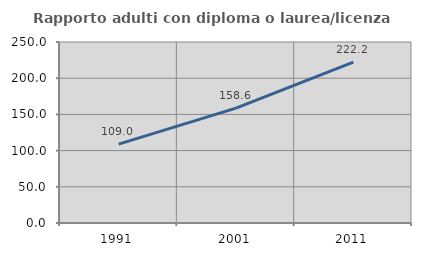
| Category | Rapporto adulti con diploma o laurea/licenza media  |
|---|---|
| 1991.0 | 109.013 |
| 2001.0 | 158.648 |
| 2011.0 | 222.236 |